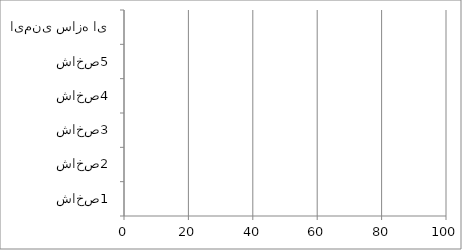
| Category | Series 0 |
|---|---|
| شاخص1 | 0 |
| شاخص2 | 0 |
| شاخص3 | 0 |
| شاخص4 | 0 |
| شاخص5 | 0 |
| ایمنی سازه ای | 0 |